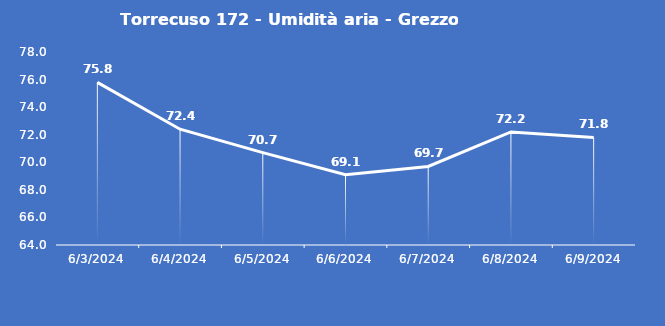
| Category | Torrecuso 172 - Umidità aria - Grezzo (%) |
|---|---|
| 6/3/24 | 75.8 |
| 6/4/24 | 72.4 |
| 6/5/24 | 70.7 |
| 6/6/24 | 69.1 |
| 6/7/24 | 69.7 |
| 6/8/24 | 72.2 |
| 6/9/24 | 71.8 |